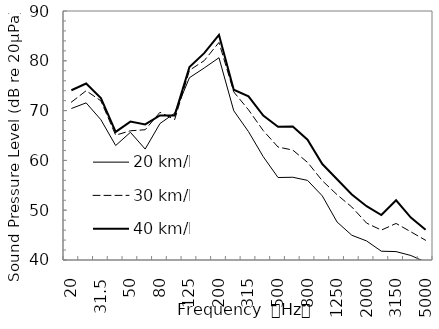
| Category | 20 km/h | 30 km/h | 40 km/h |
|---|---|---|---|
| 20.0 | 70.421 | 71.695 | 74.086 |
| 25.0 | 71.554 | 73.995 | 75.43 |
| 31.5 | 68.166 | 71.962 | 72.516 |
| 40.0 | 62.987 | 65.066 | 65.721 |
| 50.0 | 65.638 | 65.946 | 67.793 |
| 63.0 | 62.275 | 66.155 | 67.218 |
| 80.0 | 67.396 | 69.661 | 69.021 |
| 100.0 | 69.486 | 68.208 | 69.04 |
| 125.0 | 76.606 | 78.094 | 78.742 |
| 160.0 | 78.556 | 80.032 | 81.541 |
| 200.0 | 80.616 | 83.69 | 85.196 |
| 250.0 | 69.974 | 73.754 | 74.19 |
| 315.0 | 65.769 | 70.155 | 72.872 |
| 400.0 | 60.745 | 65.978 | 69.008 |
| 500.0 | 56.561 | 62.689 | 66.747 |
| 630.0 | 56.615 | 62.069 | 66.788 |
| 800.0 | 55.986 | 59.608 | 64.151 |
| 1000.0 | 52.874 | 55.92 | 59.271 |
| 1250.0 | 47.631 | 53.113 | 56.22 |
| 1600.0 | 44.968 | 50.642 | 53.158 |
| 2000.0 | 43.83 | 47.409 | 50.811 |
| 2500.0 | 41.764 | 46.008 | 49.028 |
| 3150.0 | 41.685 | 47.338 | 51.986 |
| 4000.0 | 40.904 | 45.661 | 48.509 |
| 5000.0 | 39.583 | 43.959 | 46.072 |